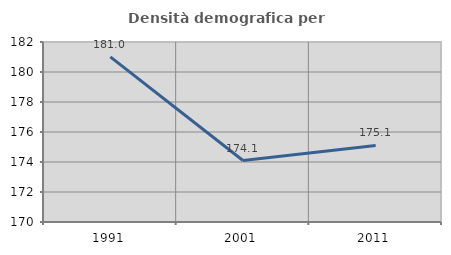
| Category | Densità demografica |
|---|---|
| 1991.0 | 181.012 |
| 2001.0 | 174.1 |
| 2011.0 | 175.108 |